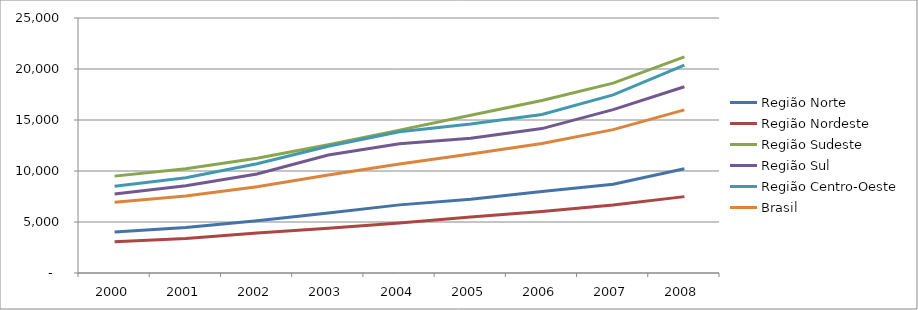
| Category | Região Norte | Região Nordeste | Região Sudeste | Região Sul | Região Centro-Oeste | Brasil |
|---|---|---|---|---|---|---|
| 2000.0 | 4008 | 3075.47 | 9498.05 | 7737.01 | 8500.24 | 6946.35 |
| 2001.0 | 4467.15 | 3382.14 | 10220.57 | 8547.4 | 9333.99 | 7553.79 |
| 2002.0 | 5132.33 | 3922.42 | 11251.51 | 9700.15 | 10713.43 | 8462.45 |
| 2003.0 | 5890.51 | 4397.71 | 12570.95 | 11560.34 | 12430.03 | 9611.21 |
| 2004.0 | 6679.46 | 4899.06 | 14008.83 | 12676.46 | 13844.87 | 10691.89 |
| 2005.0 | 7241.44 | 5498.82 | 15468.75 | 13205.96 | 14605.74 | 11658.1 |
| 2006.0 | 7987.85 | 6028.07 | 16911.71 | 14156.17 | 15545.78 | 12686.61 |
| 2007.0 | 8706.43 | 6663.58 | 18615.63 | 16020.11 | 17457.89 | 14056.27 |
| 2008.0 | 10216.48 | 7487.55 | 21182.67 | 18257.78 | 20372.09 | 15989.77 |